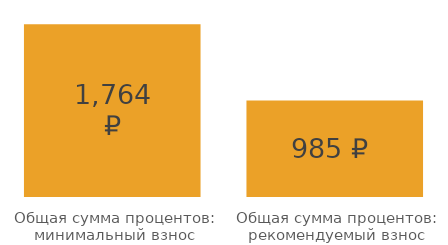
| Category | Series 0 |
|---|---|
| Общая сумма процентов: минимальный взнос | 1763.952 |
| Общая сумма процентов: рекомендуемый взнос | 984.811 |